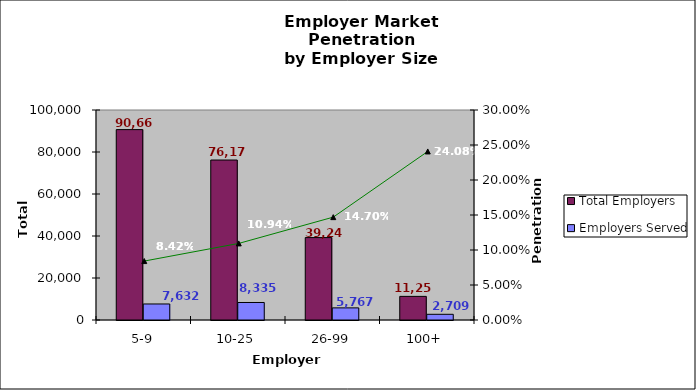
| Category | Total Employers | Employers Served |
|---|---|---|
| 5-9 | 90662 | 7632 |
| 10-25 | 76179 | 8335 |
| 26-99 | 39243 | 5767 |
| 100+ | 11250 | 2709 |